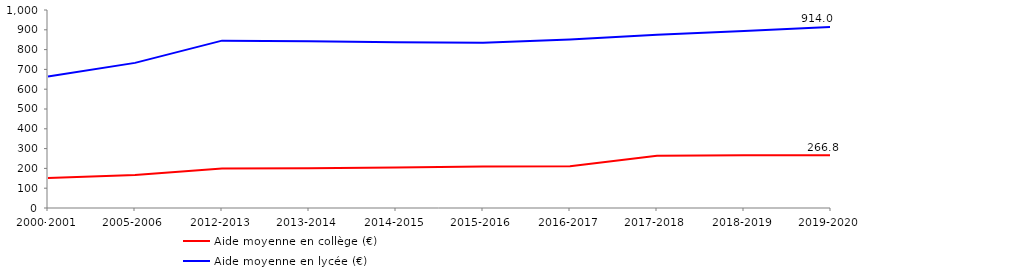
| Category | Aide moyenne en collège (€) | Aide moyenne en lycée (€) |
|---|---|---|
| 2000-2001 | 152.1 | 664 |
| 2005-2006 | 167.04 | 733 |
| 2012-2013 | 199.16 | 845.18 |
| 2013-2014 | 200.91 | 842.312 |
| 2014-2015 | 204.77 | 837.671 |
| 2015-2016 | 209.984 | 834.06 |
| 2016-2017 | 210.782 | 850.906 |
| 2017-2018 | 264.156 | 874.61 |
| 2018-2019 | 265.969 | 893.744 |
| 2019-2020 | 266.8 | 914 |